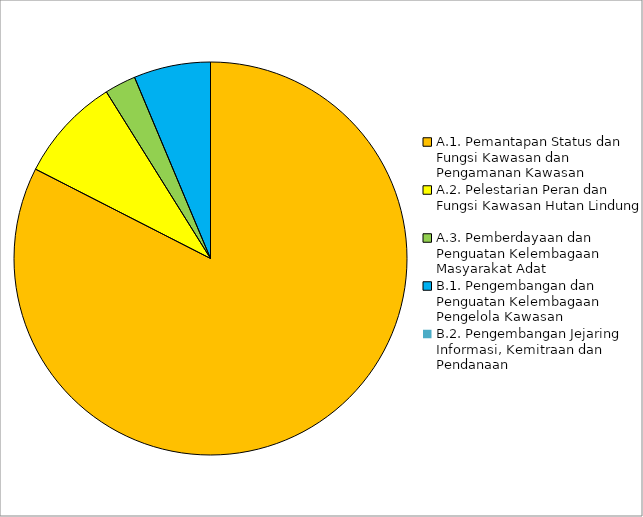
| Category | Series 0 |
|---|---|
| 0 | 16192500000 |
| 1 | 1687000000 |
| 2 | 504500000 |
| 3 | 1240000000 |
| 4 | 0 |